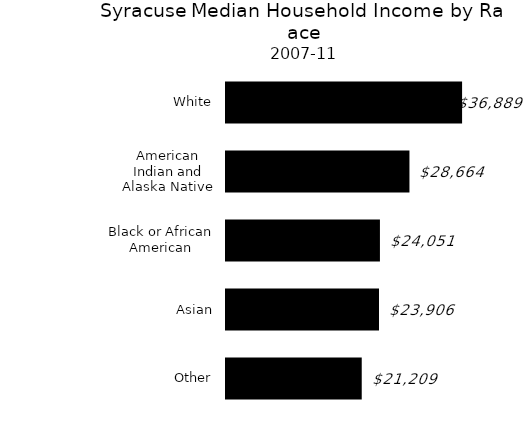
| Category | Series 0 |
|---|---|
| Other | 21209 |
| Asian | 23906 |
| Black or African American | 24051 |
| American Indian and Alaska Native | 28664 |
| White | 36889 |